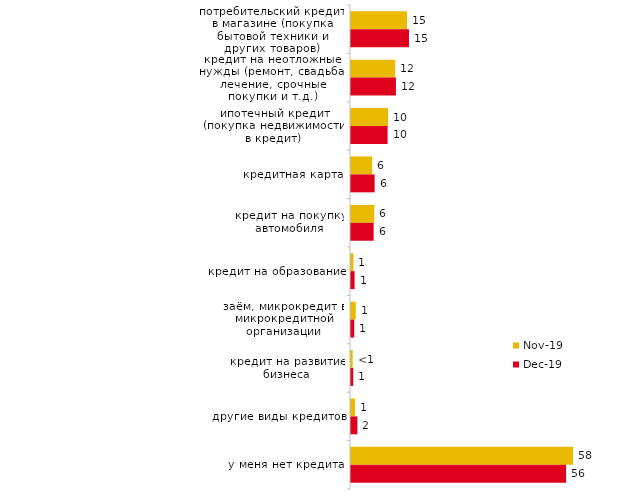
| Category | ноя.19 | дек.19 |
|---|---|---|
| потребительский кредит в магазине (покупка бытовой техники и других товаров) | 14.703 | 15.198 |
| кредит на неотложные нужды (ремонт, свадьба, лечение, срочные покупки и т.д.) | 11.584 | 11.782 |
| ипотечный кредит (покупка недвижимости в кредит) | 9.703 | 9.604 |
| кредитная карта | 5.545 | 6.188 |
| кредит на покупку автомобиля | 6.089 | 5.941 |
| кредит на образование | 0.644 | 0.941 |
| заём, микрокредит в микрокредитной организации | 1.238 | 0.842 |
| кредит на развитие бизнеса | 0.446 | 0.594 |
| другие виды кредитов | 1.04 | 1.683 |
| у меня нет кредита | 58.218 | 56.386 |